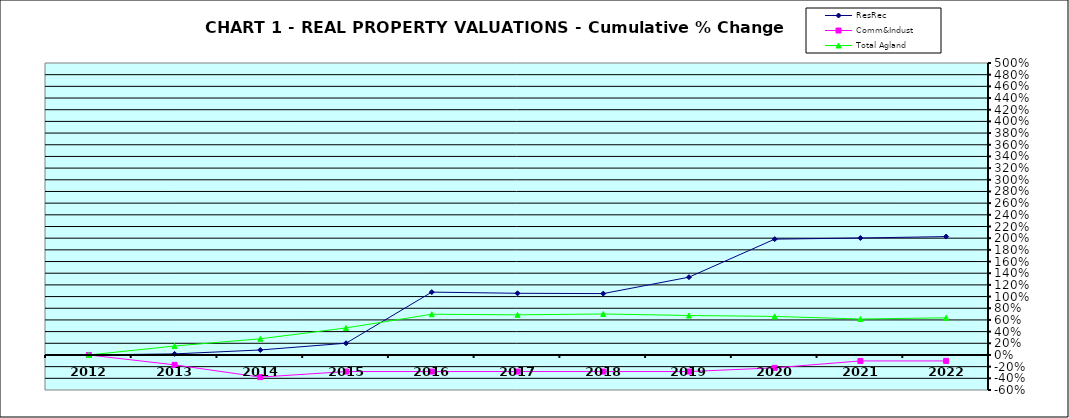
| Category | ResRec | Comm&Indust | Total Agland |
|---|---|---|---|
| 2012.0 | 0 | 0 | 0 |
| 2013.0 | 0.018 | -0.169 | 0.153 |
| 2014.0 | 0.086 | -0.379 | 0.277 |
| 2015.0 | 0.201 | -0.284 | 0.463 |
| 2016.0 | 1.076 | -0.284 | 0.698 |
| 2017.0 | 1.056 | -0.284 | 0.687 |
| 2018.0 | 1.051 | -0.284 | 0.702 |
| 2019.0 | 1.332 | -0.284 | 0.676 |
| 2020.0 | 1.984 | -0.221 | 0.66 |
| 2021.0 | 2.003 | -0.102 | 0.616 |
| 2022.0 | 2.027 | -0.102 | 0.636 |